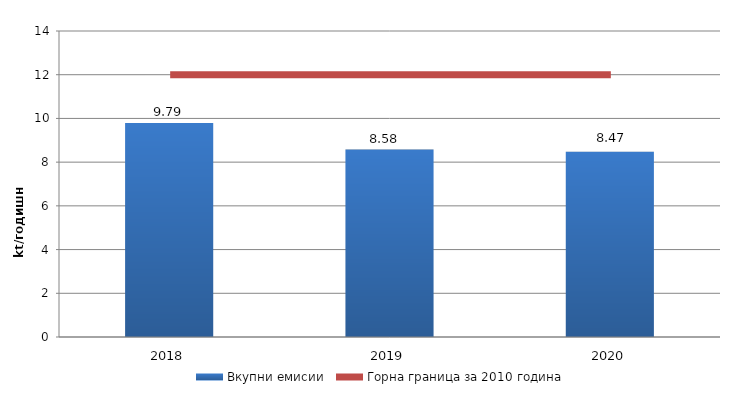
| Category | Вкупни емисии |
|---|---|
| 2018.0 | 9.787 |
| 2019.0 | 8.576 |
| 2020.0 | 8.473 |